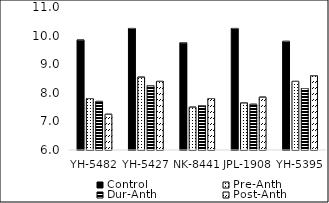
| Category | Control | Pre-Anth | Dur-Anth | Post-Anth |
|---|---|---|---|---|
| YH-5482 | 9.85 | 7.8 | 7.7 | 7.25 |
| YH-5427 | 10.25 | 8.55 | 8.25 | 8.4 |
| NK-8441 | 9.75 | 7.5 | 7.55 | 7.8 |
| JPL-1908 | 10.25 | 7.65 | 7.6 | 7.85 |
| YH-5395 | 9.8 | 8.4 | 8.15 | 8.6 |